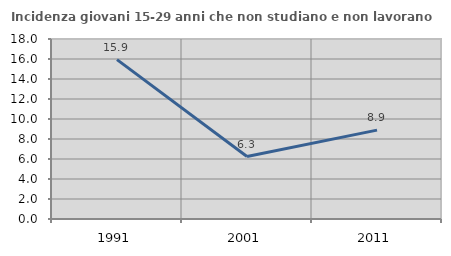
| Category | Incidenza giovani 15-29 anni che non studiano e non lavorano  |
|---|---|
| 1991.0 | 15.942 |
| 2001.0 | 6.25 |
| 2011.0 | 8.889 |